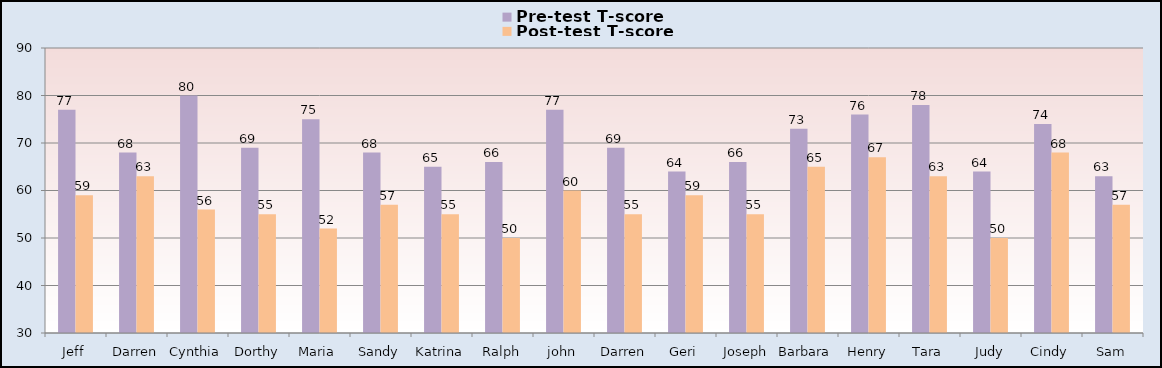
| Category | Pre-test T-score | Post-test T-score |
|---|---|---|
| Jeff | 77 | 59 |
| Darren | 68 | 63 |
| Cynthia | 80 | 56 |
| Dorthy | 69 | 55 |
| Maria | 75 | 52 |
| Sandy | 68 | 57 |
| Katrina | 65 | 55 |
| Ralph | 66 | 50 |
| john | 77 | 60 |
| Darren | 69 | 55 |
| Geri | 64 | 59 |
| Joseph | 66 | 55 |
| Barbara | 73 | 65 |
| Henry | 76 | 67 |
| Tara | 78 | 63 |
| Judy | 64 | 50 |
| Cindy | 74 | 68 |
| Sam | 63 | 57 |